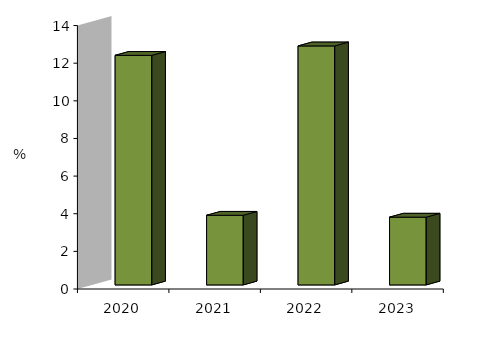
| Category | I.C.I |
|---|---|
| 2020-01-01 | 12.2 |
| 2021-01-01 | 3.7 |
| 2022-01-01 | 12.7 |
| 2023-01-01 | 3.6 |